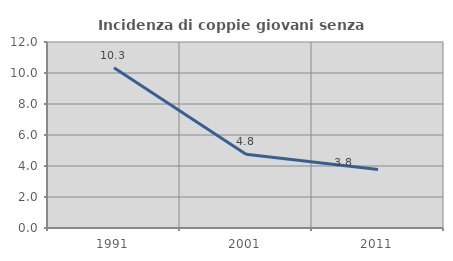
| Category | Incidenza di coppie giovani senza figli |
|---|---|
| 1991.0 | 10.345 |
| 2001.0 | 4.762 |
| 2011.0 | 3.774 |